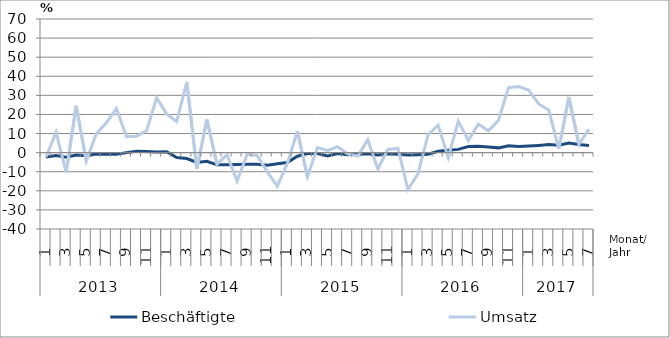
| Category | Beschäftigte | Umsatz |
|---|---|---|
| 0 | -2.3 | -2.2 |
| 1 | -1.5 | 10.7 |
| 2 | -2.4 | -10.3 |
| 3 | -1.3 | 24.6 |
| 4 | -1.6 | -4.4 |
| 5 | -0.7 | 9.9 |
| 6 | -0.8 | 15.6 |
| 7 | -0.8 | 23.1 |
| 8 | 0 | 8.4 |
| 9 | 0.7 | 8.6 |
| 10 | 0.6 | 11.5 |
| 11 | 0.3 | 28.7 |
| 12 | 0.5 | 20.3 |
| 13 | -2.6 | 16.2 |
| 14 | -3.1 | 37.1 |
| 15 | -5.1 | -8.5 |
| 16 | -4.5 | 17.4 |
| 17 | -6.4 | -6.1 |
| 18 | -6.4 | -1.1 |
| 19 | -6.2 | -14.9 |
| 20 | -6.1 | -0.9 |
| 21 | -6.1 | -1.5 |
| 22 | -6.6 | -10 |
| 23 | -5.8 | -17.6 |
| 24 | -5.2 | -5.7 |
| 25 | -1.9 | 11.2 |
| 26 | -0.5 | -12.5 |
| 27 | -0.5 | 2.7 |
| 28 | -1.7 | 1.2 |
| 29 | -0.5 | 3.1 |
| 30 | -1.1 | -0.6 |
| 31 | -0.8 | -1.8 |
| 32 | -0.6 | 6.7 |
| 33 | -1.2 | -8.6 |
| 34 | -0.6 | 1.7 |
| 35 | -0.9 | 2.2 |
| 36 | -1.3 | -19.4 |
| 37 | -1.1 | -10.9 |
| 38 | -0.8 | 9.4 |
| 39 | 0.7 | 14.4 |
| 40 | 1.2 | -2.6 |
| 41 | 1.7 | 16.5 |
| 42 | 3.2 | 6.3 |
| 43 | 3.4 | 15 |
| 44 | 3 | 11.5 |
| 45 | 2.5 | 17 |
| 46 | 3.6 | 34 |
| 47 | 3.2 | 34.6 |
| 48 | 3.5 | 32.8 |
| 49 | 3.8 | 25.5 |
| 50 | 4.2 | 22.3 |
| 51 | 3.9 | 2 |
| 52 | 5 | 29.1 |
| 53 | 4.3 | 4.3 |
| 54 | 3.8 | 12.3 |